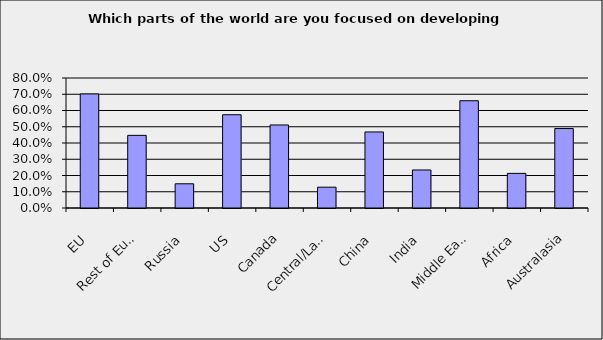
| Category | Series 0 |
|---|---|
| EU | 0.702 |
| Rest of Europe | 0.447 |
| Russia | 0.149 |
| US | 0.574 |
| Canada | 0.511 |
| Central/Latin America | 0.128 |
| China | 0.468 |
| India | 0.234 |
| Middle East | 0.66 |
| Africa | 0.213 |
| Australasia | 0.489 |